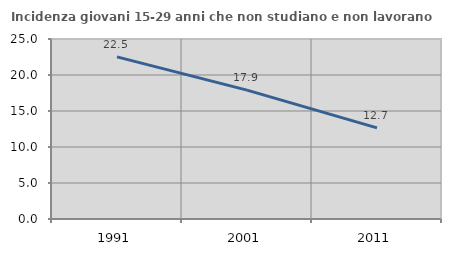
| Category | Incidenza giovani 15-29 anni che non studiano e non lavorano  |
|---|---|
| 1991.0 | 22.523 |
| 2001.0 | 17.895 |
| 2011.0 | 12.658 |